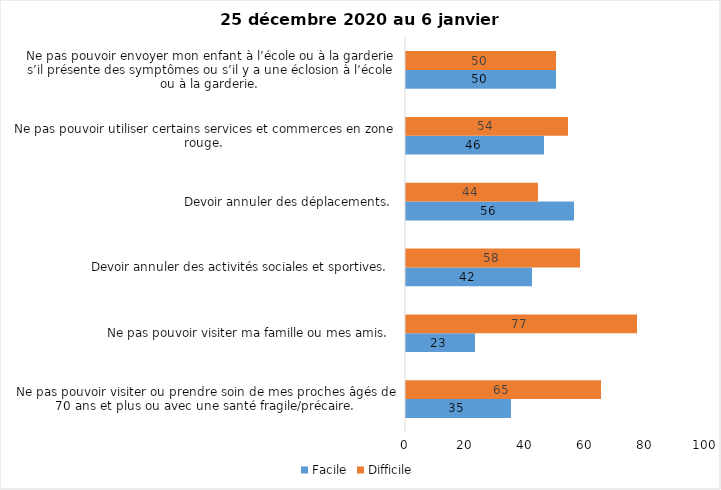
| Category | Facile | Difficile |
|---|---|---|
| Ne pas pouvoir visiter ou prendre soin de mes proches âgés de 70 ans et plus ou avec une santé fragile/précaire.  | 35 | 65 |
| Ne pas pouvoir visiter ma famille ou mes amis.  | 23 | 77 |
| Devoir annuler des activités sociales et sportives.  | 42 | 58 |
| Devoir annuler des déplacements.  | 56 | 44 |
| Ne pas pouvoir utiliser certains services et commerces en zone rouge.  | 46 | 54 |
| Ne pas pouvoir envoyer mon enfant à l’école ou à la garderie s’il présente des symptômes ou s’il y a une éclosion à l’école ou à la garderie.  | 50 | 50 |